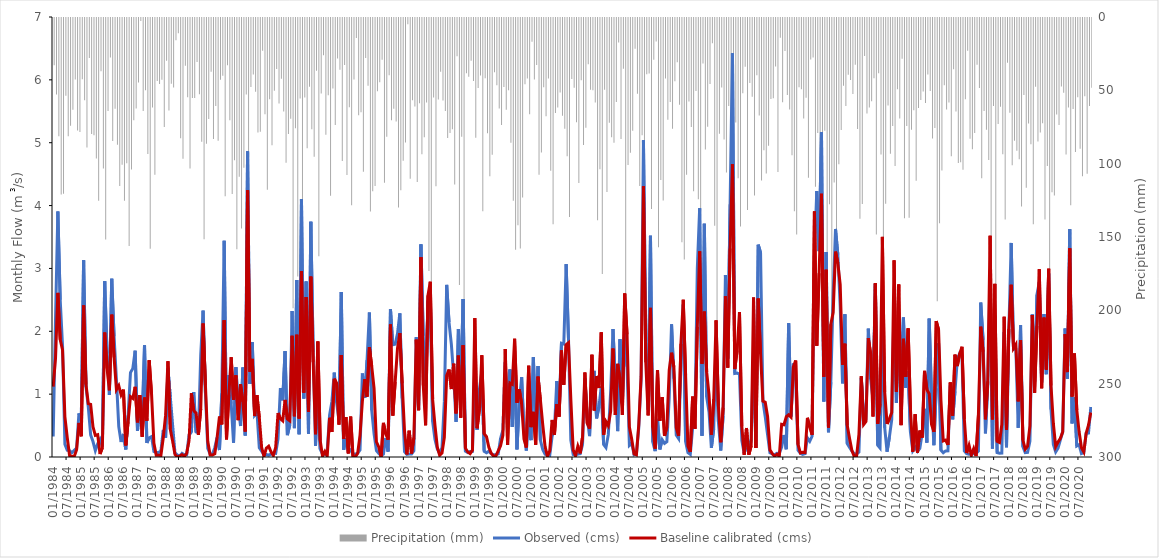
| Category | Precipitation (mm) |
|---|---|
| 1984-01-01 | 32.21 |
| 1984-02-01 | 52.22 |
| 1984-03-01 | 80.67 |
| 1984-04-01 | 120.33 |
| 1984-05-01 | 119.89 |
| 1984-06-01 | 52.97 |
| 1984-07-01 | 80.6 |
| 1984-08-01 | 73.4 |
| 1984-09-01 | 62.54 |
| 1984-10-01 | 41.94 |
| 1984-11-01 | 76.75 |
| 1984-12-01 | 77.81 |
| 1985-01-01 | 41.78 |
| 1985-02-01 | 56.1 |
| 1985-03-01 | 88.35 |
| 1985-04-01 | 27.3 |
| 1985-05-01 | 79.04 |
| 1985-06-01 | 80 |
| 1985-07-01 | 95.77 |
| 1985-08-01 | 124.54 |
| 1985-09-01 | 36.33 |
| 1985-10-01 | 102.55 |
| 1985-11-01 | 150.96 |
| 1985-12-01 | 63.4 |
| 1986-01-01 | 26.96 |
| 1986-02-01 | 83.92 |
| 1986-03-01 | 61.82 |
| 1986-04-01 | 86.38 |
| 1986-05-01 | 114.5 |
| 1986-06-01 | 100.14 |
| 1986-07-01 | 124.64 |
| 1986-08-01 | 98.96 |
| 1986-09-01 | 155.38 |
| 1986-10-01 | 103.36 |
| 1986-11-01 | 69.66 |
| 1986-12-01 | 61.75 |
| 1987-01-01 | 43.93 |
| 1987-02-01 | 2.13 |
| 1987-03-01 | 63.37 |
| 1987-04-01 | 49.32 |
| 1987-05-01 | 92.72 |
| 1987-06-01 | 157.31 |
| 1987-07-01 | 60.99 |
| 1987-08-01 | 106.85 |
| 1987-09-01 | 42.98 |
| 1987-10-01 | 45.02 |
| 1987-11-01 | 42.08 |
| 1987-12-01 | 74.24 |
| 1988-01-01 | 29.08 |
| 1988-02-01 | 62.99 |
| 1988-03-01 | 44.83 |
| 1988-04-01 | 47.4 |
| 1988-05-01 | 15.13 |
| 1988-06-01 | 10.4 |
| 1988-07-01 | 82.01 |
| 1988-08-01 | 95.89 |
| 1988-09-01 | 32.49 |
| 1988-10-01 | 54.1 |
| 1988-11-01 | 102.63 |
| 1988-12-01 | 54.56 |
| 1989-01-01 | 54.47 |
| 1989-02-01 | 30.07 |
| 1989-03-01 | 51.97 |
| 1989-04-01 | 84.39 |
| 1989-05-01 | 150.77 |
| 1989-06-01 | 85.75 |
| 1989-07-01 | 68.84 |
| 1989-08-01 | 36.59 |
| 1989-09-01 | 82.42 |
| 1989-10-01 | 60.06 |
| 1989-11-01 | 83.73 |
| 1989-12-01 | 42.15 |
| 1990-01-01 | 39.33 |
| 1990-02-01 | 121.57 |
| 1990-03-01 | 32.26 |
| 1990-04-01 | 69.73 |
| 1990-05-01 | 120.03 |
| 1990-06-01 | 96.95 |
| 1990-07-01 | 157.64 |
| 1990-08-01 | 108.29 |
| 1990-09-01 | 143.54 |
| 1990-10-01 | 102.15 |
| 1990-11-01 | 52.15 |
| 1990-12-01 | 186.76 |
| 1991-01-01 | 46.99 |
| 1991-02-01 | 38.49 |
| 1991-03-01 | 50.23 |
| 1991-04-01 | 78 |
| 1991-05-01 | 77.62 |
| 1991-06-01 | 22.26 |
| 1991-07-01 | 65.64 |
| 1991-08-01 | 117.18 |
| 1991-09-01 | 55.33 |
| 1991-10-01 | 86.78 |
| 1991-11-01 | 49.68 |
| 1991-12-01 | 34.82 |
| 1992-01-01 | 58.35 |
| 1992-02-01 | 41.37 |
| 1992-03-01 | 63.72 |
| 1992-04-01 | 98.74 |
| 1992-05-01 | 79.14 |
| 1992-06-01 | 68.72 |
| 1992-07-01 | 197.87 |
| 1992-08-01 | 75.21 |
| 1992-09-01 | 176.29 |
| 1992-10-01 | 54.86 |
| 1992-11-01 | 141.46 |
| 1992-12-01 | 54.12 |
| 1993-01-01 | 88.73 |
| 1993-02-01 | 46.81 |
| 1993-03-01 | 75.91 |
| 1993-04-01 | 94.63 |
| 1993-05-01 | 36.04 |
| 1993-06-01 | 162.36 |
| 1993-07-01 | 51.47 |
| 1993-08-01 | 25.32 |
| 1993-09-01 | 79.67 |
| 1993-10-01 | 52.73 |
| 1993-11-01 | 121.26 |
| 1993-12-01 | 48.02 |
| 1994-01-01 | 73 |
| 1994-02-01 | 27.67 |
| 1994-03-01 | 35.24 |
| 1994-04-01 | 97.43 |
| 1994-05-01 | 32.13 |
| 1994-06-01 | 106.98 |
| 1994-07-01 | 60.9 |
| 1994-08-01 | 127.74 |
| 1994-09-01 | 41.91 |
| 1994-10-01 | 13.68 |
| 1994-11-01 | 66.39 |
| 1994-12-01 | 64.18 |
| 1995-01-01 | 104.77 |
| 1995-02-01 | 27.35 |
| 1995-03-01 | 46.2 |
| 1995-04-01 | 131.91 |
| 1995-05-01 | 118.14 |
| 1995-06-01 | 114.56 |
| 1995-07-01 | 49.98 |
| 1995-08-01 | 43.76 |
| 1995-09-01 | 28.48 |
| 1995-10-01 | 112.31 |
| 1995-11-01 | 80.96 |
| 1995-12-01 | 39.01 |
| 1996-01-01 | 69.68 |
| 1996-02-01 | 61.82 |
| 1996-03-01 | 70.49 |
| 1996-04-01 | 129.26 |
| 1996-05-01 | 117.51 |
| 1996-06-01 | 97.26 |
| 1996-07-01 | 84.92 |
| 1996-08-01 | 4.33 |
| 1996-09-01 | 109.52 |
| 1996-10-01 | 56.08 |
| 1996-11-01 | 60.31 |
| 1996-12-01 | 111.76 |
| 1997-01-01 | 58.17 |
| 1997-02-01 | 92.92 |
| 1997-03-01 | 81.31 |
| 1997-04-01 | 57.58 |
| 1997-05-01 | 172.44 |
| 1997-06-01 | 183.74 |
| 1997-07-01 | 54.25 |
| 1997-08-01 | 114.7 |
| 1997-09-01 | 55.54 |
| 1997-10-01 | 36.58 |
| 1997-11-01 | 56.33 |
| 1997-12-01 | 63.48 |
| 1998-01-01 | 81.82 |
| 1998-02-01 | 78.49 |
| 1998-03-01 | 75.77 |
| 1998-04-01 | 113.5 |
| 1998-05-01 | 26.01 |
| 1998-06-01 | 182.04 |
| 1998-07-01 | 80.89 |
| 1998-08-01 | 223.5 |
| 1998-09-01 | 37.74 |
| 1998-10-01 | 40.02 |
| 1998-11-01 | 29.15 |
| 1998-12-01 | 43 |
| 1999-01-01 | 81.65 |
| 1999-02-01 | 47.69 |
| 1999-03-01 | 39.16 |
| 1999-04-01 | 131.82 |
| 1999-05-01 | 41.08 |
| 1999-06-01 | 78.55 |
| 1999-07-01 | 107.89 |
| 1999-08-01 | 93.21 |
| 1999-09-01 | 37.07 |
| 1999-10-01 | 45.82 |
| 1999-11-01 | 61.69 |
| 1999-12-01 | 72.98 |
| 2000-01-01 | 47.12 |
| 2000-02-01 | 62.62 |
| 2000-03-01 | 49.2 |
| 2000-04-01 | 85.07 |
| 2000-05-01 | 124.56 |
| 2000-06-01 | 157.96 |
| 2000-07-01 | 141.35 |
| 2000-08-01 | 157.17 |
| 2000-09-01 | 122.43 |
| 2000-10-01 | 45.16 |
| 2000-11-01 | 41.17 |
| 2000-12-01 | 65.68 |
| 2001-01-01 | 16.19 |
| 2001-02-01 | 41.97 |
| 2001-03-01 | 31.99 |
| 2001-04-01 | 106.79 |
| 2001-05-01 | 91.68 |
| 2001-06-01 | 47.3 |
| 2001-07-01 | 67 |
| 2001-08-01 | 41.31 |
| 2001-09-01 | 104.14 |
| 2001-10-01 | 140.54 |
| 2001-11-01 | 64.72 |
| 2001-12-01 | 61.03 |
| 2002-01-01 | 50.76 |
| 2002-02-01 | 66.64 |
| 2002-03-01 | 75.47 |
| 2002-04-01 | 94.22 |
| 2002-05-01 | 135.76 |
| 2002-06-01 | 41.51 |
| 2002-07-01 | 47.62 |
| 2002-08-01 | 71.06 |
| 2002-09-01 | 112.47 |
| 2002-10-01 | 42.38 |
| 2002-11-01 | 86.56 |
| 2002-12-01 | 74.9 |
| 2003-01-01 | 31.52 |
| 2003-02-01 | 48.93 |
| 2003-03-01 | 49.26 |
| 2003-04-01 | 57.59 |
| 2003-05-01 | 137.84 |
| 2003-06-01 | 103.04 |
| 2003-07-01 | 174.57 |
| 2003-08-01 | 48.97 |
| 2003-09-01 | 118.67 |
| 2003-10-01 | 71.37 |
| 2003-11-01 | 81.39 |
| 2003-12-01 | 85.04 |
| 2004-01-01 | 57.3 |
| 2004-02-01 | 16.65 |
| 2004-03-01 | 82.42 |
| 2004-04-01 | 34.66 |
| 2004-05-01 | 221.64 |
| 2004-06-01 | 100.19 |
| 2004-07-01 | 91.94 |
| 2004-08-01 | 76.96 |
| 2004-09-01 | 21.01 |
| 2004-10-01 | 51.7 |
| 2004-11-01 | 114.49 |
| 2004-12-01 | 79.94 |
| 2005-01-01 | 154.63 |
| 2005-02-01 | 38.38 |
| 2005-03-01 | 37.78 |
| 2005-04-01 | 130.17 |
| 2005-05-01 | 28.45 |
| 2005-06-01 | 16.07 |
| 2005-07-01 | 156.33 |
| 2005-08-01 | 110.5 |
| 2005-09-01 | 124.49 |
| 2005-10-01 | 41.29 |
| 2005-11-01 | 69.43 |
| 2005-12-01 | 57.19 |
| 2006-01-01 | 75.52 |
| 2006-02-01 | 43.12 |
| 2006-03-01 | 30.23 |
| 2006-04-01 | 59.16 |
| 2006-05-01 | 152.98 |
| 2006-06-01 | 164.61 |
| 2006-07-01 | 106.9 |
| 2006-08-01 | 57.01 |
| 2006-09-01 | 74.26 |
| 2006-10-01 | 118.06 |
| 2006-11-01 | 49.7 |
| 2006-12-01 | 123.58 |
| 2007-01-01 | 134.5 |
| 2007-02-01 | 31.07 |
| 2007-03-01 | 89.62 |
| 2007-04-01 | 74.18 |
| 2007-05-01 | 44.92 |
| 2007-06-01 | 17.14 |
| 2007-07-01 | 141.73 |
| 2007-08-01 | 238.04 |
| 2007-09-01 | 78.92 |
| 2007-10-01 | 47.35 |
| 2007-11-01 | 82.77 |
| 2007-12-01 | 105.33 |
| 2008-01-01 | 59.94 |
| 2008-02-01 | 130.27 |
| 2008-03-01 | 152.09 |
| 2008-04-01 | 71.22 |
| 2008-05-01 | 109.29 |
| 2008-06-01 | 142.21 |
| 2008-07-01 | 51.24 |
| 2008-08-01 | 33.27 |
| 2008-09-01 | 130.96 |
| 2008-10-01 | 44.38 |
| 2008-11-01 | 53.69 |
| 2008-12-01 | 121.01 |
| 2009-01-01 | 39 |
| 2009-02-01 | 66.53 |
| 2009-03-01 | 110.76 |
| 2009-04-01 | 90.22 |
| 2009-05-01 | 105.98 |
| 2009-06-01 | 87.05 |
| 2009-07-01 | 55.27 |
| 2009-08-01 | 54.79 |
| 2009-09-01 | 33.12 |
| 2009-10-01 | 104.94 |
| 2009-11-01 | 13.5 |
| 2009-12-01 | 57.44 |
| 2010-01-01 | 22.57 |
| 2010-02-01 | 52.45 |
| 2010-03-01 | 62.32 |
| 2010-04-01 | 93.54 |
| 2010-05-01 | 131.75 |
| 2010-06-01 | 147.62 |
| 2010-07-01 | 47.15 |
| 2010-08-01 | 48.66 |
| 2010-09-01 | 68.48 |
| 2010-10-01 | 54.33 |
| 2010-11-01 | 108.85 |
| 2010-12-01 | 28.31 |
| 2011-01-01 | 26.99 |
| 2011-02-01 | 115.13 |
| 2011-03-01 | 78.4 |
| 2011-04-01 | 145.47 |
| 2011-05-01 | 230.35 |
| 2011-06-01 | 76.92 |
| 2011-07-01 | 213.3 |
| 2011-08-01 | 127.06 |
| 2011-09-01 | 220.04 |
| 2011-10-01 | 112.16 |
| 2011-11-01 | 151.9 |
| 2011-12-01 | 99.65 |
| 2012-01-01 | 76.44 |
| 2012-02-01 | 46.14 |
| 2012-03-01 | 60.02 |
| 2012-04-01 | 38.71 |
| 2012-05-01 | 42.2 |
| 2012-06-01 | 51.88 |
| 2012-07-01 | 31.96 |
| 2012-08-01 | 75.7 |
| 2012-09-01 | 136.93 |
| 2012-10-01 | 126.8 |
| 2012-11-01 | 25.86 |
| 2012-12-01 | 65.06 |
| 2013-01-01 | 61.09 |
| 2013-02-01 | 56.83 |
| 2013-03-01 | 41.02 |
| 2013-04-01 | 147.55 |
| 2013-05-01 | 37.6 |
| 2013-06-01 | 93.13 |
| 2013-07-01 | 259.16 |
| 2013-08-01 | 126.68 |
| 2013-09-01 | 59.64 |
| 2013-10-01 | 92.58 |
| 2013-11-01 | 73.61 |
| 2013-12-01 | 100.97 |
| 2014-01-01 | 48.63 |
| 2014-02-01 | 68.53 |
| 2014-03-01 | 27.84 |
| 2014-04-01 | 136.53 |
| 2014-05-01 | 73.59 |
| 2014-06-01 | 136.19 |
| 2014-07-01 | 76.11 |
| 2014-08-01 | 62.95 |
| 2014-09-01 | 111.04 |
| 2014-10-01 | 61.34 |
| 2014-11-01 | 55.98 |
| 2014-12-01 | 50.14 |
| 2015-01-01 | 57.91 |
| 2015-02-01 | 38.5 |
| 2015-03-01 | 49.84 |
| 2015-04-01 | 82.16 |
| 2015-05-01 | 75.08 |
| 2015-06-01 | 193.05 |
| 2015-07-01 | 139.88 |
| 2015-08-01 | 103.9 |
| 2015-09-01 | 45.92 |
| 2015-10-01 | 62.36 |
| 2015-11-01 | 57.68 |
| 2015-12-01 | 94.28 |
| 2016-01-01 | 34.87 |
| 2016-02-01 | 63.78 |
| 2016-03-01 | 98.94 |
| 2016-04-01 | 98.31 |
| 2016-05-01 | 103.52 |
| 2016-06-01 | 55.38 |
| 2016-07-01 | 22.38 |
| 2016-08-01 | 82.28 |
| 2016-09-01 | 89.52 |
| 2016-10-01 | 78.35 |
| 2016-11-01 | 31.79 |
| 2016-12-01 | 47.65 |
| 2017-01-01 | 109.3 |
| 2017-02-01 | 63.35 |
| 2017-03-01 | 76.13 |
| 2017-04-01 | 96.9 |
| 2017-05-01 | 169.33 |
| 2017-06-01 | 59.99 |
| 2017-07-01 | 225.91 |
| 2017-08-01 | 72.32 |
| 2017-09-01 | 60.49 |
| 2017-10-01 | 92.82 |
| 2017-11-01 | 137.35 |
| 2017-12-01 | 30.56 |
| 2018-01-01 | 64.6 |
| 2018-02-01 | 100.47 |
| 2018-03-01 | 83.67 |
| 2018-04-01 | 90.58 |
| 2018-05-01 | 96.32 |
| 2018-06-01 | 128.5 |
| 2018-07-01 | 52.58 |
| 2018-08-01 | 115.7 |
| 2018-09-01 | 71.85 |
| 2018-10-01 | 86.15 |
| 2018-11-01 | 140.63 |
| 2018-12-01 | 46.95 |
| 2019-01-01 | 84.24 |
| 2019-02-01 | 78.1 |
| 2019-03-01 | 71.76 |
| 2019-04-01 | 137.47 |
| 2019-05-01 | 100.87 |
| 2019-06-01 | 171.37 |
| 2019-07-01 | 118.74 |
| 2019-08-01 | 121.04 |
| 2019-09-01 | 65.8 |
| 2019-10-01 | 72.88 |
| 2019-11-01 | 46.69 |
| 2019-12-01 | 51.02 |
| 2020-01-01 | 93 |
| 2020-02-01 | 60.94 |
| 2020-03-01 | 127.64 |
| 2020-04-01 | 62.08 |
| 2020-05-01 | 91.29 |
| 2020-06-01 | 54.04 |
| 2020-07-01 | 89.13 |
| 2020-08-01 | 107.83 |
| 2020-09-01 | 53.33 |
| 2020-10-01 | 106.25 |
| 2020-11-01 | 60.06 |
| 2020-12-01 | 47.51 |